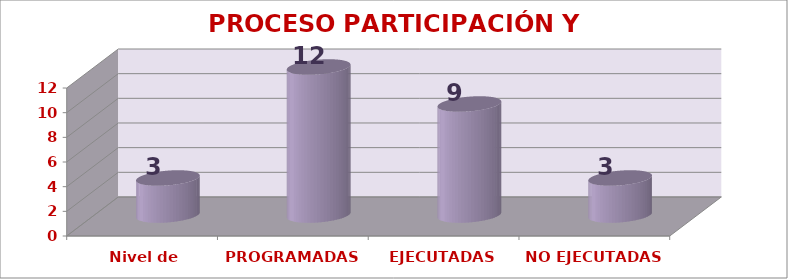
| Category | PROCESO PARTICIPACIÓN Y CONVIVENCIA |
|---|---|
| Nivel de satisfacción | 3 |
| PROGRAMADAS | 12 |
| EJECUTADAS | 9 |
| NO EJECUTADAS | 3 |